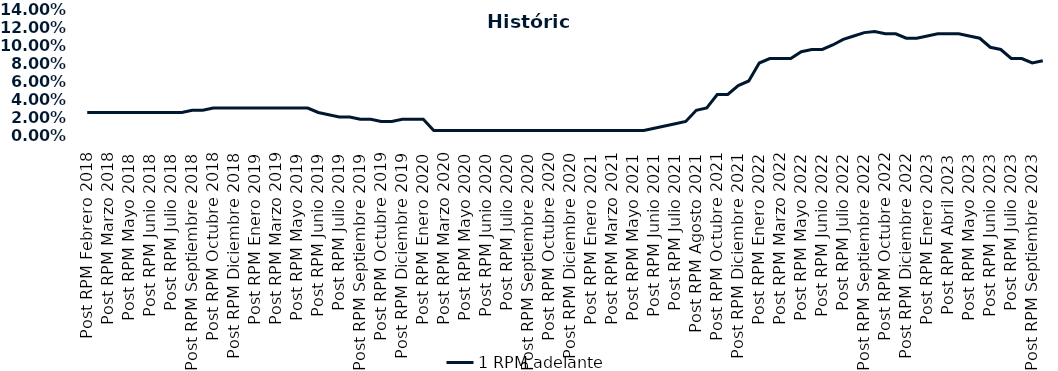
| Category | 1 RPM adelante |
|---|---|
| Post RPM Febrero 2018 | 0.025 |
| Pre RPM Marzo 2018 | 0.025 |
| Post RPM Marzo 2018 | 0.025 |
| Pre RPM Mayo 2018 | 0.025 |
| Post RPM Mayo 2018 | 0.025 |
| Pre RPM Junio 2018 | 0.025 |
| Post RPM Junio 2018 | 0.025 |
| Pre RPM Julio 2018 | 0.025 |
| Post RPM Julio 2018 | 0.025 |
| Pre RPM Septiembre 2018 | 0.025 |
| Post RPM Septiembre 2018 | 0.028 |
| Pre RPM Octubre 2018 | 0.028 |
| Post RPM Octubre 2018 | 0.03 |
| Pre RPM Diciembre 2018 | 0.03 |
| Post RPM Diciembre 2018 | 0.03 |
| Pre RPM Enero 2019 | 0.03 |
| Post RPM Enero 2019 | 0.03 |
| Pre RPM Marzo 2019 | 0.03 |
| Post RPM Marzo 2019 | 0.03 |
| Pre RPM Mayo 2019 | 0.03 |
| Post RPM Mayo 2019 | 0.03 |
| Pre RPM Junio 2019 | 0.03 |
| Post RPM Junio 2019 | 0.025 |
| Pre RPM Julio 2019 | 0.022 |
| Post RPM Julio 2019 | 0.02 |
| Pre RPM Septiembre 2019 | 0.02 |
| Post RPM Septiembre 2019 | 0.018 |
| Pre RPM Octubre 2019 | 0.018 |
| Post RPM Octubre 2019 | 0.015 |
| Pre RPM Diciembre 2019 | 0.015 |
| Post RPM Diciembre 2019 | 0.018 |
| Pre RPM Enero 2020 | 0.018 |
| Post RPM Enero 2020 | 0.018 |
| Pre RPM Marzo 2020 | 0.005 |
| Post RPM Marzo 2020 | 0.005 |
| Pre RPM Mayo 2020 | 0.005 |
| Post RPM Mayo 2020 | 0.005 |
| Pre RPM Junio 2020 | 0.005 |
| Post RPM Junio 2020 | 0.005 |
| Pre RPM Julio 2020 | 0.005 |
| Post RPM Julio 2020 | 0.005 |
| Pre RPM Septiembre 2020 | 0.005 |
| Post RPM Septiembre 2020 | 0.005 |
| Pre RPM Octubre 2020 | 0.005 |
| Post RPM Octubre 2020 | 0.005 |
| Pre RPM Diciembre 2020 | 0.005 |
| Post RPM Diciembre 2020 | 0.005 |
| Pre RPM Enero 2021 | 0.005 |
| Post RPM Enero 2021 | 0.005 |
| Pre RPM Marzo 2021 | 0.005 |
| Post RPM Marzo 2021 | 0.005 |
| Pre RPM Mayo 2021 | 0.005 |
| Post RPM Mayo 2021 | 0.005 |
| Pre RPM Junio 2021 | 0.005 |
| Post RPM Junio 2021 | 0.008 |
| Pre RPM Julio 2021 | 0.01 |
| Post RPM Julio 2021 | 0.012 |
| Pre RPM Agosto 2021 | 0.015 |
| Post RPM Agosto 2021 | 0.028 |
| Pre RPM Octubre 2021 | 0.03 |
| Post RPM Octubre 2021 | 0.045 |
| Pre RPM Diciembre 2021 | 0.045 |
| Post RPM Diciembre 2021 | 0.055 |
| Pre RPM Enero 2022 | 0.06 |
| Post RPM Enero 2022 | 0.08 |
| Pre RPM Marzo 2022 | 0.085 |
| Post RPM Marzo 2022 | 0.085 |
| Pre RPM Mayo 2022 | 0.085 |
| Post RPM Mayo 2022 | 0.092 |
| Pre RPM Junio 2022 | 0.095 |
| Post RPM Junio 2022 | 0.095 |
| Pre RPM Julio 2022 | 0.1 |
| Post RPM Julio 2022 | 0.106 |
| Pre RPM Septiembre 2022 | 0.11 |
| Post RPM Septiembre 2022 | 0.114 |
| Pre RPM Octubre 2022 | 0.115 |
| Post RPM Octubre 2022 | 0.112 |
| Pre RPM Diciembre 2022 | 0.112 |
| Post RPM Diciembre 2022 | 0.108 |
| Pre RPM Enero 2023 | 0.108 |
| Post RPM Enero 2023 | 0.11 |
| Pre RPM Abril 2023 | 0.112 |
| Post RPM Abril 2023 | 0.112 |
| Pre RPM Mayo 2023 | 0.112 |
| Post RPM Mayo 2023 | 0.11 |
| Pre RPM Junio 2023 | 0.108 |
| Post RPM Junio 2023 | 0.098 |
| Pre RPM Julio 2023 | 0.095 |
| Post RPM Julio 2023 | 0.085 |
| Pre RPM Septiembre 2023 | 0.085 |
| Post RPM Septiembre 2023 | 0.08 |
| Pre RPM Octubre 2023 | 0.082 |